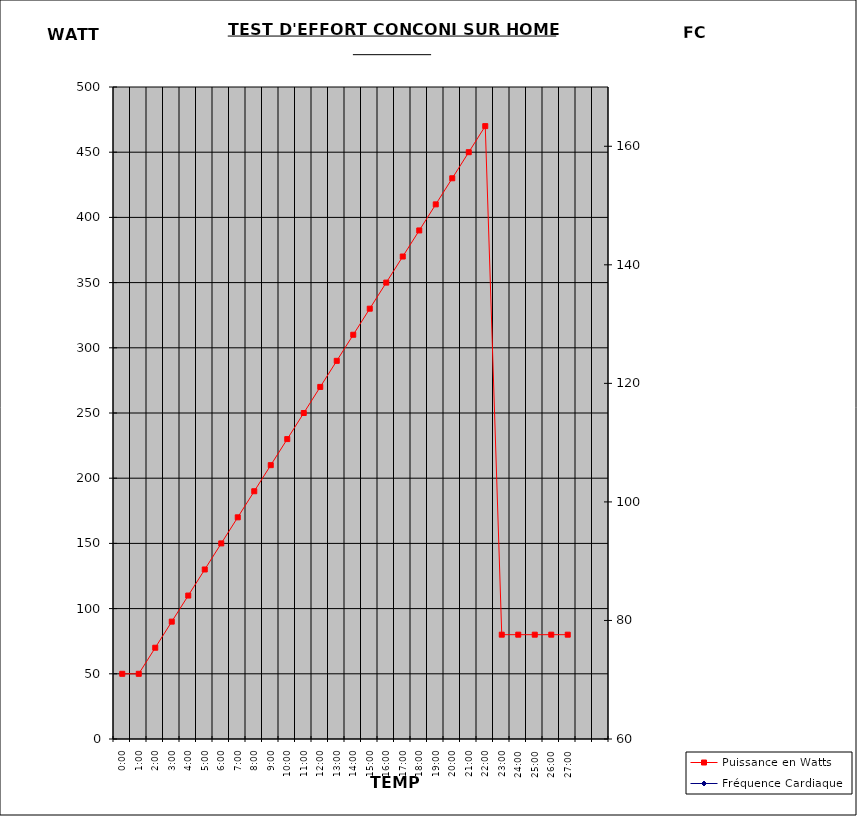
| Category | Puissance en Watts |
|---|---|
| 00:00 | 50 |
| 01:00 | 50 |
| 02:00 | 70 |
| 03:00 | 90 |
| 04:00 | 110 |
| 05:00 | 130 |
| 06:00 | 150 |
| 07:00 | 170 |
| 08:00 | 190 |
| 09:00 | 210 |
| 10:00 | 230 |
| 11:00 | 250 |
| 12:00 | 270 |
| 13:00 | 290 |
| 14:00 | 310 |
| 15:00 | 330 |
| 16:00 | 350 |
| 17:00 | 370 |
| 18:00 | 390 |
| 19:00 | 410 |
| 20:00 | 430 |
| 21:00 | 450 |
| 22:00 | 470 |
| 23:00 | 80 |
|  24:00 | 80 |
|  25:00 | 80 |
|  26:00 | 80 |
|  27:00 | 80 |